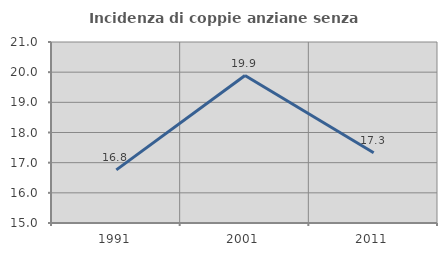
| Category | Incidenza di coppie anziane senza figli  |
|---|---|
| 1991.0 | 16.76 |
| 2001.0 | 19.89 |
| 2011.0 | 17.327 |